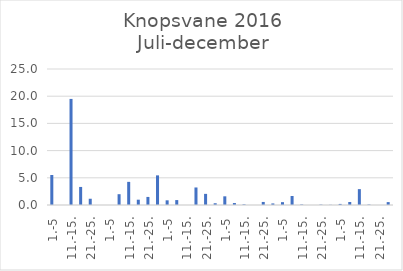
| Category | Series 0 |
|---|---|
| 1.-5 | 5.52 |
| 6.-10. | 0 |
| 11.-15. | 19.5 |
| 16.-20. | 3.319 |
| 21.-25. | 1.149 |
| 26.-31. | 0 |
| 1.-5 | 0 |
| 6.-10. | 1.985 |
| 11.-15. | 4.253 |
| 16.-20. | 0.975 |
| 21.-25. | 1.483 |
| 26.-31. | 5.448 |
| 1.-5 | 0.861 |
| 6.-10. | 0.906 |
| 11.-15. | 0 |
| 16.-20. | 3.221 |
| 21.-25. | 2.047 |
| 26.-30. | 0.323 |
| 1.-5 | 1.596 |
| 6.-10. | 0.361 |
| 11.-15. | 0.118 |
| 16.-20. | 0 |
| 21.-25. | 0.561 |
| 26.-31. | 0.288 |
| 1.-5 | 0.526 |
| 6.-10. | 1.658 |
| 11.-15. | 0.096 |
| 16.-20. | 0 |
| 21.-25. | 0.073 |
| 26.-30. | 0.033 |
| 1.-5 | 0.199 |
| 6.-10. | 0.556 |
| 11.-15. | 2.916 |
| 16.-20. | 0.086 |
| 21.-25. | 0 |
| 26.-31. | 0.531 |